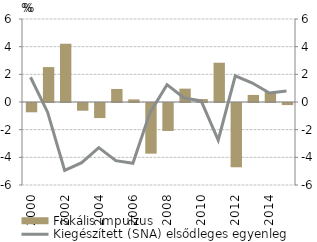
| Category | Fiskális impulzus |
|---|---|
| 2000-01-01 | -0.672 |
| 2001-01-01 | 2.524 |
| 2002-01-01 | 4.211 |
| 2003-01-01 | -0.559 |
| 2004-01-01 | -1.087 |
| 2005-01-01 | 0.942 |
| 2006-01-01 | 0.187 |
| 2007-01-01 | -3.662 |
| 2008-01-01 | -2.021 |
| 2009-01-01 | 0.965 |
| 2010-01-01 | 0.209 |
| 2011-01-01 | 2.839 |
| 2012-01-01 | -4.645 |
| 2013-01-01 | 0.512 |
| 2014-01-01 | 0.728 |
| 2015-01-01 | -0.151 |